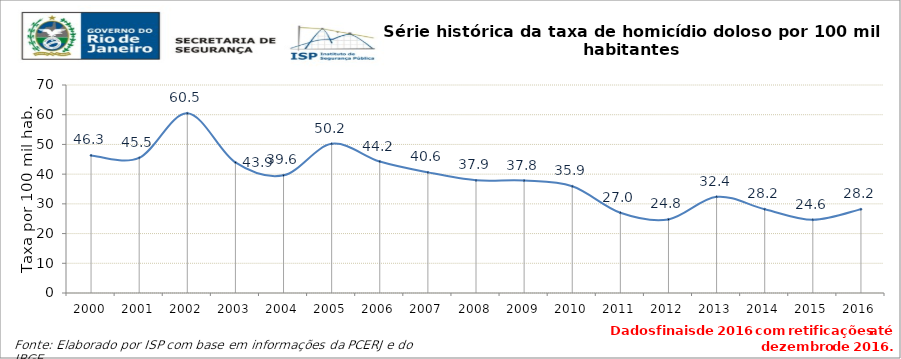
| Category | Series 0 |
|---|---|
| 2000.0 | 46.311 |
| 2001.0 | 45.488 |
| 2002.0 | 60.476 |
| 2003.0 | 43.935 |
| 2004.0 | 39.597 |
| 2005.0 | 50.196 |
| 2006.0 | 44.236 |
| 2007.0 | 40.599 |
| 2008.0 | 37.93 |
| 2009.0 | 37.826 |
| 2010.0 | 35.919 |
| 2011.0 | 27.008 |
| 2012.0 | 24.771 |
| 2013.0 | 32.364 |
| 2014.0 | 28.195 |
| 2015.0 | 24.623 |
| 2016.0 | 28.195 |